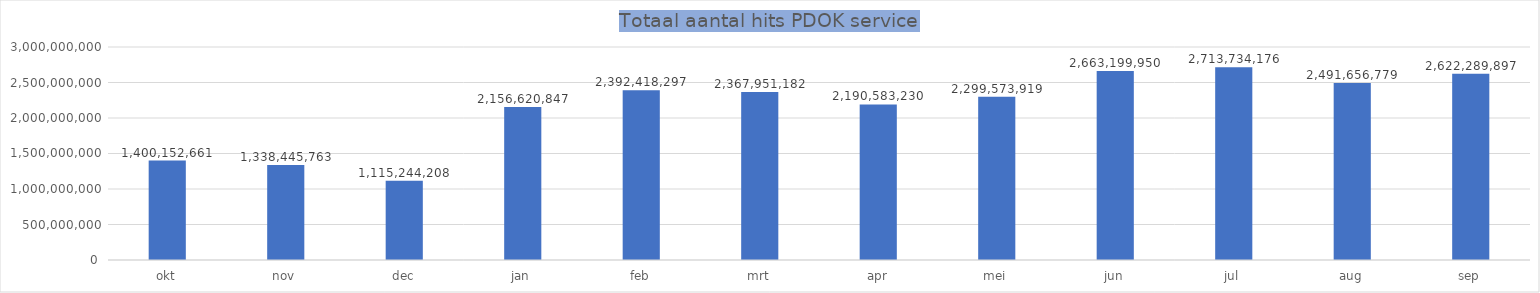
| Category | Series 0 |
|---|---|
| okt | 1400152661 |
| nov | 1338445763 |
| dec | 1115244208 |
| jan | 2156620847 |
| feb | 2392418297 |
| mrt | 2367951182 |
| apr | 2190583230 |
| mei | 2299573919 |
| jun | 2663199950 |
| jul | 2713734176 |
| aug | 2491656779 |
| sep | 2622289897 |